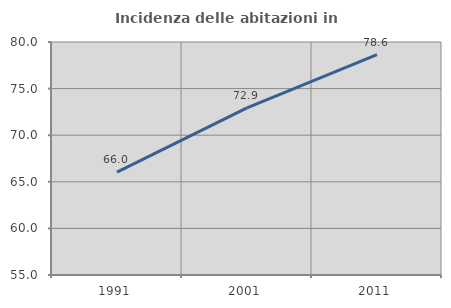
| Category | Incidenza delle abitazioni in proprietà  |
|---|---|
| 1991.0 | 66.038 |
| 2001.0 | 72.939 |
| 2011.0 | 78.641 |